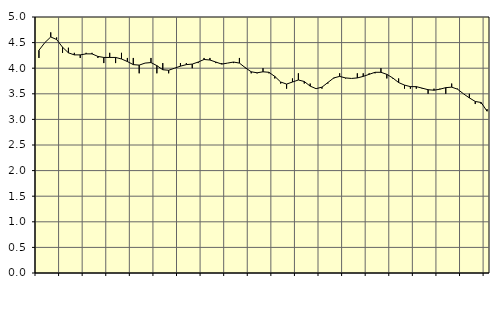
| Category | Piggar | Jordbruk, skogsbruk o fiske, SNI 01-03 |
|---|---|---|
| nan | 4.2 | 4.35 |
| 1.0 | 4.5 | 4.5 |
| 1.0 | 4.7 | 4.61 |
| 1.0 | 4.6 | 4.56 |
| nan | 4.3 | 4.41 |
| 2.0 | 4.4 | 4.3 |
| 2.0 | 4.3 | 4.26 |
| 2.0 | 4.2 | 4.26 |
| nan | 4.3 | 4.28 |
| 3.0 | 4.3 | 4.28 |
| 3.0 | 4.2 | 4.23 |
| 3.0 | 4.1 | 4.21 |
| nan | 4.3 | 4.21 |
| 4.0 | 4.1 | 4.21 |
| 4.0 | 4.3 | 4.18 |
| 4.0 | 4.2 | 4.13 |
| nan | 4.2 | 4.07 |
| 5.0 | 3.9 | 4.06 |
| 5.0 | 4.1 | 4.1 |
| 5.0 | 4.2 | 4.11 |
| nan | 3.9 | 4.05 |
| 6.0 | 4.1 | 3.97 |
| 6.0 | 3.9 | 3.96 |
| 6.0 | 4 | 4 |
| nan | 4.1 | 4.04 |
| 7.0 | 4.1 | 4.07 |
| 7.0 | 4 | 4.08 |
| 7.0 | 4.1 | 4.12 |
| nan | 4.2 | 4.17 |
| 8.0 | 4.2 | 4.16 |
| 8.0 | 4.1 | 4.12 |
| 8.0 | 4.1 | 4.08 |
| nan | 4.1 | 4.1 |
| 9.0 | 4.1 | 4.12 |
| 9.0 | 4.2 | 4.1 |
| 9.0 | 4 | 4.01 |
| nan | 3.9 | 3.93 |
| 10.0 | 3.9 | 3.91 |
| 10.0 | 4 | 3.93 |
| 10.0 | 3.9 | 3.92 |
| nan | 3.8 | 3.84 |
| 11.0 | 3.7 | 3.73 |
| 11.0 | 3.6 | 3.69 |
| 11.0 | 3.8 | 3.73 |
| nan | 3.9 | 3.77 |
| 12.0 | 3.7 | 3.74 |
| 12.0 | 3.7 | 3.65 |
| 12.0 | 3.6 | 3.6 |
| nan | 3.6 | 3.63 |
| 13.0 | 3.7 | 3.72 |
| 13.0 | 3.8 | 3.81 |
| 13.0 | 3.9 | 3.84 |
| nan | 3.8 | 3.81 |
| 14.0 | 3.8 | 3.8 |
| 14.0 | 3.9 | 3.81 |
| 14.0 | 3.9 | 3.84 |
| nan | 3.9 | 3.88 |
| 15.0 | 3.9 | 3.92 |
| 15.0 | 4 | 3.92 |
| 15.0 | 3.8 | 3.88 |
| nan | 3.8 | 3.81 |
| 16.0 | 3.8 | 3.72 |
| 16.0 | 3.6 | 3.67 |
| 16.0 | 3.6 | 3.64 |
| nan | 3.6 | 3.64 |
| 17.0 | 3.6 | 3.61 |
| 17.0 | 3.5 | 3.58 |
| 17.0 | 3.6 | 3.57 |
| nan | 3.6 | 3.59 |
| 18.0 | 3.5 | 3.62 |
| 18.0 | 3.7 | 3.63 |
| 18.0 | 3.6 | 3.59 |
| nan | 3.5 | 3.5 |
| 19.0 | 3.5 | 3.42 |
| 19.0 | 3.3 | 3.35 |
| 19.0 | 3.3 | 3.33 |
| nan | 3.2 | 3.16 |